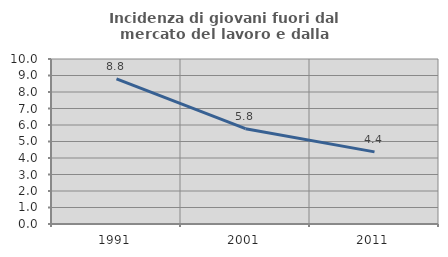
| Category | Incidenza di giovani fuori dal mercato del lavoro e dalla formazione  |
|---|---|
| 1991.0 | 8.795 |
| 2001.0 | 5.776 |
| 2011.0 | 4.371 |